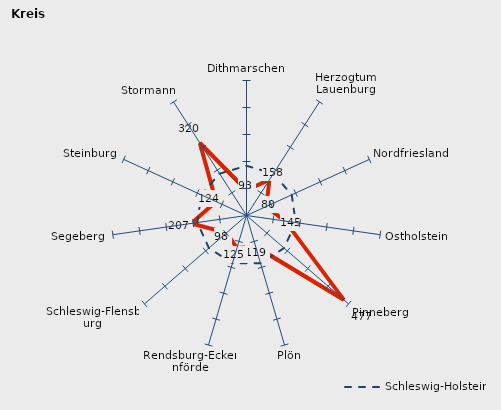
| Category | Kreise | Schleswig-Holstein |
|---|---|---|
| Dithmarschen | 93.302 | 184.182 |
| Herzogtum Lauenburg | 157.673 | 184.182 |
| Nordfriesland | 80.222 | 184.182 |
| Ostholstein | 144.64 | 184.182 |
| Pinneberg | 477.355 | 184.182 |
| Plön | 119.378 | 184.182 |
| Rendsburg-Eckernförde | 125.476 | 184.182 |
| Schleswig-Flensburg | 97.837 | 184.182 |
| Segeberg | 206.779 | 184.182 |
| Steinburg | 123.81 | 184.182 |
| Stormann | 319.74 | 184.182 |